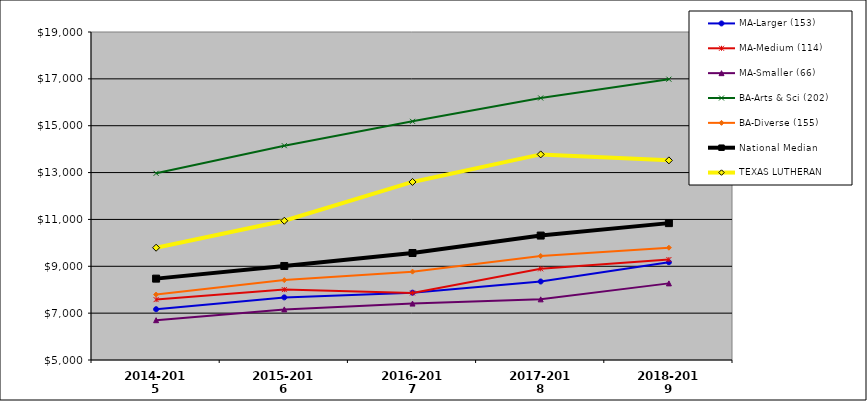
| Category | MA-Larger (153) | MA-Medium (114) | MA-Smaller (66) | BA-Arts & Sci (202) | BA-Diverse (155) | National Median |  TEXAS LUTHERAN  |
|---|---|---|---|---|---|---|---|
| 2014-2015 | 7167.516 | 7577.248 | 6698.943 | 12968.209 | 7793.906 | 8473.314 | 9792.02 |
| 2015-2016 | 7672.704 | 8004.671 | 7160.472 | 14146.918 | 8409.634 | 9013.486 | 10943.363 |
| 2016-2017 | 7873.167 | 7862.909 | 7408.538 | 15187.636 | 8771.044 | 9566.64 | 12600.824 |
| 2017-2018 | 8350.409 | 8890.996 | 7588.874 | 16183.836 | 9439.578 | 10311.147 | 13775.86 |
| 2018-2019 | 9173.762 | 9287.256 | 8270.259 | 16985.643 | 9793.38 | 10842.044 | 13520.988 |